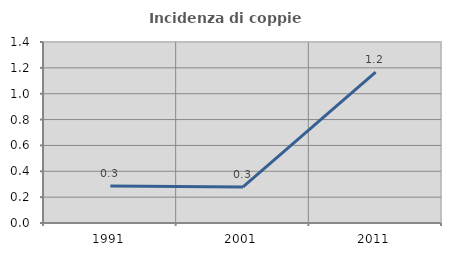
| Category | Incidenza di coppie miste |
|---|---|
| 1991.0 | 0.286 |
| 2001.0 | 0.279 |
| 2011.0 | 1.166 |